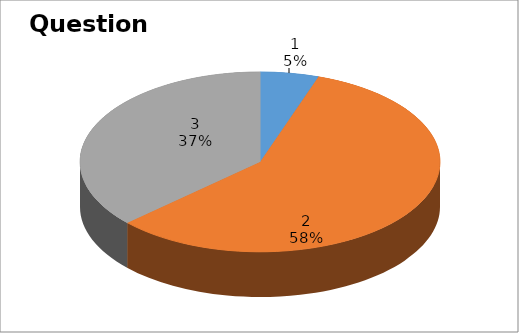
| Category | Series 0 |
|---|---|
| 0 | 1 |
| 1 | 11 |
| 2 | 7 |